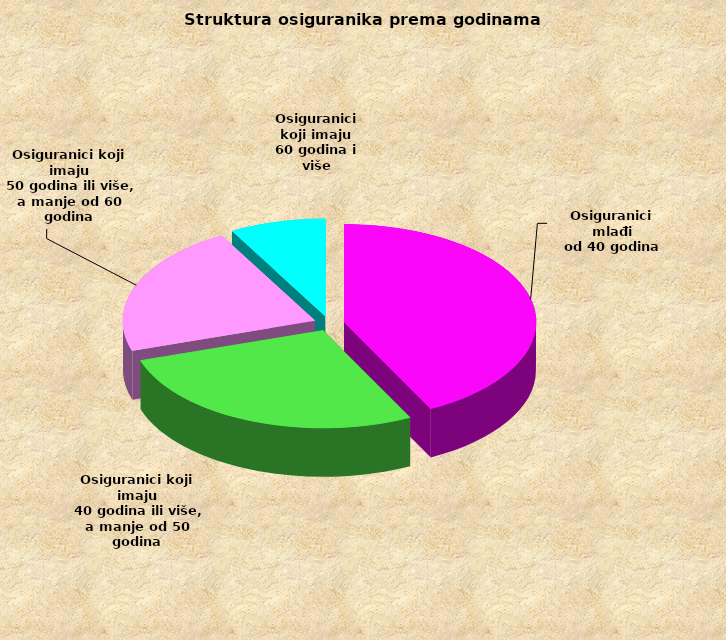
| Category | Series 0 |
|---|---|
| Osiguranici mlađi
od 40 godina | 700204 |
| Osiguranici koji imaju
 40 godina ili više, a manje od 50 godina | 452399 |
| Osiguranici koji imaju
 50 godina ili više, a manje od 60 godina | 360976 |
| Osiguranici koji imaju
60 godina i više | 132961 |